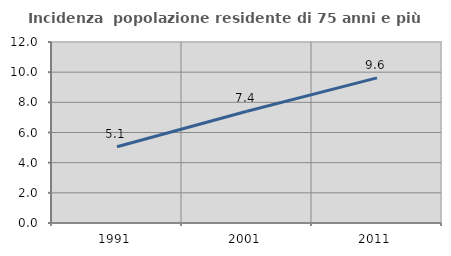
| Category | Incidenza  popolazione residente di 75 anni e più |
|---|---|
| 1991.0 | 5.053 |
| 2001.0 | 7.409 |
| 2011.0 | 9.62 |